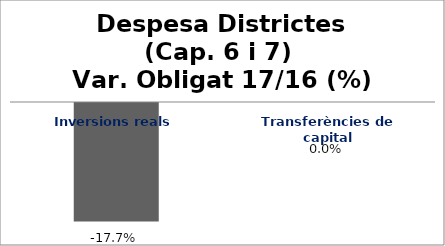
| Category | Series 0 |
|---|---|
| Inversions reals | -0.177 |
| Transferències de capital | 0 |